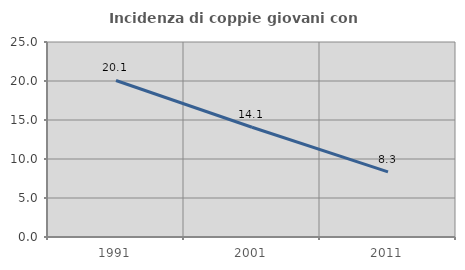
| Category | Incidenza di coppie giovani con figli |
|---|---|
| 1991.0 | 20.069 |
| 2001.0 | 14.072 |
| 2011.0 | 8.34 |